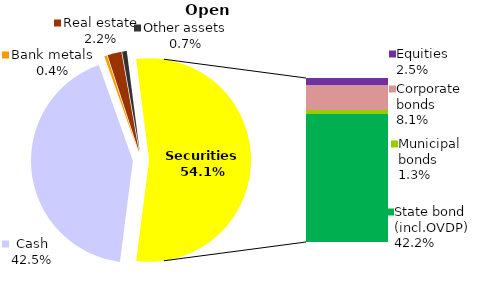
| Category | Open |
|---|---|
| Cash | 524.447 |
| Bank metals | 5.312 |
| Real estate | 27.407 |
| Other assets | 9.123 |
| Equities | 30.43 |
| Corporate bonds | 99.576 |
| Municipal bonds | 16.381 |
| State bond (incl.OVDP) | 520.392 |